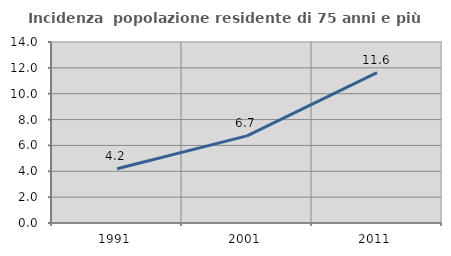
| Category | Incidenza  popolazione residente di 75 anni e più |
|---|---|
| 1991.0 | 4.2 |
| 2001.0 | 6.736 |
| 2011.0 | 11.624 |